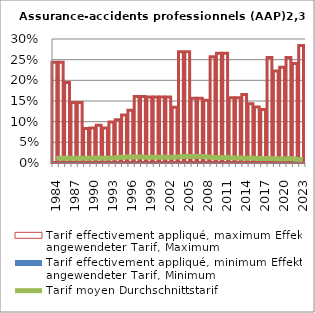
| Category | Tarif effectivement appliqué, maximum | Tarif effectivement appliqué, minimum |
|---|---|---|
| 1984.0 | 0.243 | 0.001 |
| 1985.0 | 0.243 | 0.001 |
| 1986.0 | 0.195 | 0.001 |
| 1987.0 | 0.146 | 0.001 |
| 1988.0 | 0.146 | 0 |
| 1989.0 | 0.083 | 0 |
| 1990.0 | 0.084 | 0 |
| 1991.0 | 0.092 | 0 |
| 1992.0 | 0.084 | 0 |
| 1993.0 | 0.099 | 0 |
| 1994.0 | 0.104 | 0 |
| 1995.0 | 0.116 | 0 |
| 1996.0 | 0.127 | 0 |
| 1997.0 | 0.161 | 0 |
| 1998.0 | 0.161 | 0 |
| 1999.0 | 0.16 | 0 |
| 2000.0 | 0.16 | 0 |
| 2001.0 | 0.16 | 0 |
| 2002.0 | 0.16 | 0 |
| 2003.0 | 0.135 | 0 |
| 2004.0 | 0.269 | 0 |
| 2005.0 | 0.269 | 0 |
| 2006.0 | 0.157 | 0 |
| 2007.0 | 0.157 | 0 |
| 2008.0 | 0.152 | 0.001 |
| 2009.0 | 0.257 | 0 |
| 2010.0 | 0.266 | 0 |
| 2011.0 | 0.266 | 0 |
| 2012.0 | 0.158 | 0 |
| 2013.0 | 0.158 | 0 |
| 2014.0 | 0.166 | 0 |
| 2015.0 | 0.143 | 0 |
| 2016.0 | 0.135 | 0 |
| 2017.0 | 0.13 | 0 |
| 2018.0 | 0.255 | 0 |
| 2019.0 | 0.223 | 0 |
| 2020.0 | 0.231 | 0 |
| 2021.0 | 0.255 | 0 |
| 2022.0 | 0.241 | 0 |
| 2023.0 | 0.284 | 0 |